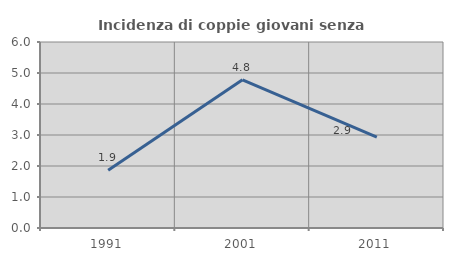
| Category | Incidenza di coppie giovani senza figli |
|---|---|
| 1991.0 | 1.86 |
| 2001.0 | 4.781 |
| 2011.0 | 2.929 |